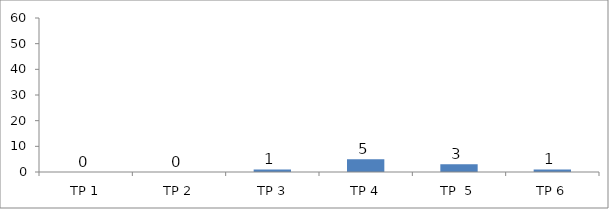
| Category | BIL. MURID |
|---|---|
| TP 1 | 0 |
| TP 2 | 0 |
|  TP 3 | 1 |
| TP 4 | 5 |
| TP  5 | 3 |
| TP 6 | 1 |